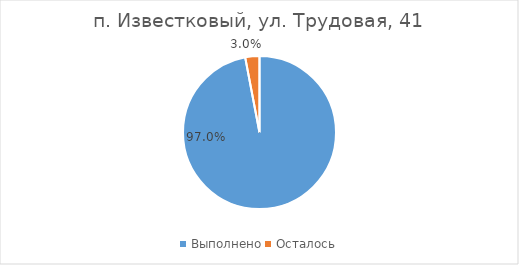
| Category | п. Известковый, ул. Трудовая, 41 |
|---|---|
| Выполнено | 0.97 |
| Осталось | 0.03 |